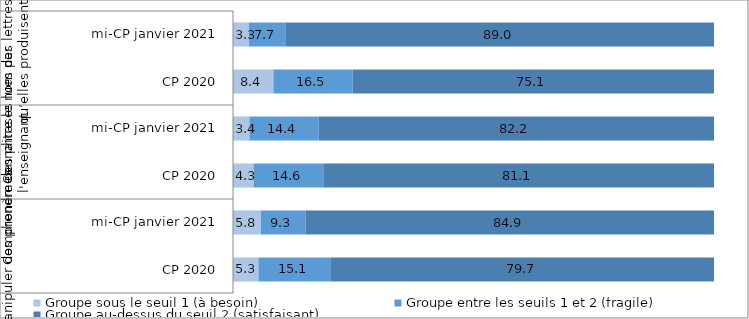
| Category | Groupe sous le seuil 1 (à besoin) | Groupe entre les seuils 1 et 2 (fragile) | Groupe au-dessus du seuil 2 (satisfaisant) |
|---|---|---|---|
| 0 | 5.3 | 15.1 | 79.7 |
| 1 | 5.8 | 9.3 | 84.9 |
| 2 | 4.3 | 14.6 | 81.1 |
| 3 | 3.4 | 14.4 | 82.2 |
| 4 | 8.4 | 16.5 | 75.1 |
| 5 | 3.3 | 7.7 | 89 |